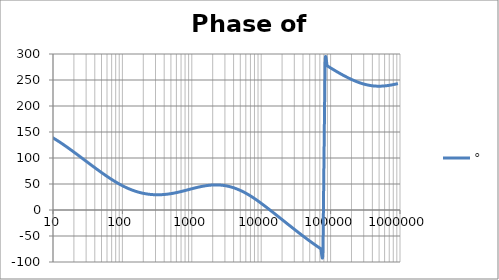
| Category | ° |
|---|---|
| 1.0 | 175.432 |
| 1.0715193052376064 | 175.106 |
| 1.1481536214968828 | 174.757 |
| 1.2302687708123814 | 174.384 |
| 1.318256738556407 | 173.984 |
| 1.4125375446227544 | 173.555 |
| 1.513561248436208 | 173.097 |
| 1.6218100973589298 | 172.606 |
| 1.7378008287493754 | 172.081 |
| 1.8620871366628673 | 171.519 |
| 1.9952623149688797 | 170.918 |
| 2.1379620895022318 | 170.275 |
| 2.2908676527677727 | 169.587 |
| 2.45470891568503 | 168.853 |
| 2.6302679918953817 | 168.068 |
| 2.8183829312644537 | 167.23 |
| 3.0199517204020156 | 166.335 |
| 3.235936569296282 | 165.38 |
| 3.467368504525316 | 164.362 |
| 3.7153522909717256 | 163.277 |
| 3.9810717055349727 | 162.122 |
| 4.265795188015926 | 160.893 |
| 4.570881896148749 | 159.587 |
| 4.897788193684462 | 158.2 |
| 5.2480746024977245 | 156.73 |
| 5.62341325190349 | 155.173 |
| 6.025595860743575 | 153.528 |
| 6.456542290346554 | 151.791 |
| 6.918309709189363 | 149.961 |
| 7.4131024130091765 | 148.036 |
| 7.943282347242814 | 146.018 |
| 8.511380382023765 | 143.905 |
| 9.120108393559095 | 141.699 |
| 9.772372209558105 | 139.402 |
| 10.47128548050899 | 137.017 |
| 11.22018454301963 | 134.548 |
| 12.022644346174127 | 131.999 |
| 12.88249551693134 | 129.376 |
| 13.803842646028851 | 126.686 |
| 14.791083881682074 | 123.934 |
| 15.848931924611136 | 121.128 |
| 16.98243652461744 | 118.274 |
| 18.197008586099834 | 115.381 |
| 19.498445997580447 | 112.455 |
| 20.892961308540382 | 109.501 |
| 22.387211385683386 | 106.528 |
| 23.988329190194897 | 103.54 |
| 25.703957827688622 | 100.542 |
| 27.54228703338165 | 97.539 |
| 29.51209226666385 | 94.535 |
| 31.62277660168379 | 91.535 |
| 33.884415613920254 | 88.543 |
| 36.307805477010106 | 85.561 |
| 38.90451449942804 | 82.595 |
| 41.686938347033525 | 79.649 |
| 44.6683592150963 | 76.728 |
| 47.86300923226381 | 73.837 |
| 51.28613839913647 | 70.982 |
| 54.95408738576247 | 68.171 |
| 58.88436553555889 | 65.409 |
| 63.09573444801931 | 62.705 |
| 67.60829753919813 | 60.067 |
| 72.44359600749901 | 57.501 |
| 77.62471166286915 | 55.017 |
| 83.17637711026705 | 52.621 |
| 89.12509381337456 | 50.321 |
| 95.49925860214357 | 48.123 |
| 102.32929922807544 | 46.033 |
| 109.64781961431841 | 44.057 |
| 117.48975549395293 | 42.198 |
| 125.89254117941665 | 40.46 |
| 134.89628825916537 | 38.846 |
| 144.54397707459273 | 37.357 |
| 154.88166189124806 | 35.996 |
| 165.95869074375608 | 34.762 |
| 177.82794100389225 | 33.655 |
| 190.5460717963248 | 32.676 |
| 204.17379446695278 | 31.824 |
| 218.77616239495524 | 31.097 |
| 234.42288153199212 | 30.494 |
| 251.18864315095806 | 30.014 |
| 269.15348039269156 | 29.655 |
| 288.4031503126605 | 29.415 |
| 309.0295432513591 | 29.292 |
| 331.1311214825911 | 29.284 |
| 354.81338923357566 | 29.388 |
| 380.18939632056095 | 29.6 |
| 407.3802778041123 | 29.919 |
| 436.5158322401654 | 30.338 |
| 467.7351412871979 | 30.855 |
| 501.18723362727184 | 31.464 |
| 537.0317963702526 | 32.159 |
| 575.4399373371566 | 32.933 |
| 616.5950018614822 | 33.778 |
| 660.6934480075952 | 34.686 |
| 707.9457843841375 | 35.646 |
| 758.5775750291831 | 36.649 |
| 812.8305161640983 | 37.682 |
| 870.9635899560801 | 38.734 |
| 933.2543007969903 | 39.792 |
| 999.9999999999998 | 40.842 |
| 1071.5193052376057 | 41.87 |
| 1148.1536214968828 | 42.864 |
| 1230.2687708123801 | 43.809 |
| 1318.2567385564053 | 44.693 |
| 1412.537544622753 | 45.503 |
| 1513.5612484362066 | 46.227 |
| 1621.8100973589292 | 46.855 |
| 1737.8008287493742 | 47.376 |
| 1862.0871366628671 | 47.781 |
| 1995.2623149688786 | 48.063 |
| 2137.9620895022326 | 48.212 |
| 2290.867652767771 | 48.224 |
| 2454.708915685027 | 48.093 |
| 2630.26799189538 | 47.813 |
| 2818.382931264451 | 47.381 |
| 3019.9517204020176 | 46.794 |
| 3235.9365692962774 | 46.048 |
| 3467.368504525316 | 45.143 |
| 3715.352290971724 | 44.076 |
| 3981.07170553497 | 42.848 |
| 4265.795188015923 | 41.459 |
| 4570.881896148745 | 39.911 |
| 4897.788193684463 | 38.206 |
| 5248.074602497726 | 36.347 |
| 5623.413251903489 | 34.34 |
| 6025.595860743574 | 32.19 |
| 6456.54229034655 | 29.903 |
| 6918.309709189357 | 27.489 |
| 7413.102413009165 | 24.955 |
| 7943.282347242815 | 22.312 |
| 8511.380382023763 | 19.571 |
| 9120.108393559092 | 16.742 |
| 9772.3722095581 | 13.836 |
| 10471.285480509003 | 10.866 |
| 11220.184543019639 | 7.841 |
| 12022.64434617411 | 4.772 |
| 12882.495516931338 | 1.668 |
| 13803.842646028841 | -1.463 |
| 14791.083881682063 | -4.615 |
| 15848.931924611119 | -7.78 |
| 16982.436524617453 | -10.954 |
| 18197.008586099837 | -14.134 |
| 19498.445997580417 | -17.317 |
| 20892.961308540387 | -20.5 |
| 22387.211385683382 | -23.68 |
| 23988.32919019488 | -26.857 |
| 25703.957827688606 | -30.027 |
| 27542.28703338167 | -33.188 |
| 29512.092266663854 | -36.338 |
| 31622.77660168378 | -39.473 |
| 33884.41561392023 | -42.589 |
| 36307.805477010166 | -45.684 |
| 38904.514499428085 | -48.753 |
| 41686.93834703348 | -51.793 |
| 44668.35921509631 | -54.799 |
| 47863.00923226382 | -57.769 |
| 51286.13839913646 | -60.7 |
| 54954.08738576241 | -63.589 |
| 58884.365535558936 | -66.435 |
| 63095.73444801934 | -69.237 |
| 67608.29753919817 | -71.993 |
| 72443.59600749899 | -74.705 |
| 77624.71166286913 | -77.371 |
| 83176.37711026703 | 280.008 |
| 89125.09381337445 | 277.431 |
| 95499.25860214363 | 274.898 |
| 102329.29922807543 | 272.41 |
| 109647.81961431848 | 269.967 |
| 117489.75549395289 | 267.571 |
| 125892.54117941685 | 265.224 |
| 134896.28825916522 | 262.929 |
| 144543.97707459255 | 260.69 |
| 154881.66189124787 | 258.512 |
| 165958.69074375575 | 256.402 |
| 177827.9410038922 | 254.366 |
| 190546.07179632425 | 252.413 |
| 204173.79446695274 | 250.551 |
| 218776.16239495497 | 248.788 |
| 234422.88153199226 | 247.135 |
| 251188.64315095753 | 245.599 |
| 269153.480392691 | 244.189 |
| 288403.15031266044 | 242.913 |
| 309029.5432513582 | 241.779 |
| 331131.1214825907 | 240.791 |
| 354813.3892335749 | 239.955 |
| 380189.3963205612 | 239.275 |
| 407380.2778041119 | 238.75 |
| 436515.8322401649 | 238.383 |
| 467735.14128719777 | 238.17 |
| 501187.2336272717 | 238.109 |
| 537031.7963702519 | 238.194 |
| 575439.9373371559 | 238.42 |
| 616595.001861482 | 238.777 |
| 660693.4480075944 | 239.258 |
| 707945.7843841374 | 239.85 |
| 758577.575029183 | 240.544 |
| 812830.5161640996 | 241.326 |
| 870963.5899560791 | 242.185 |
| 933254.3007969892 | 243.107 |